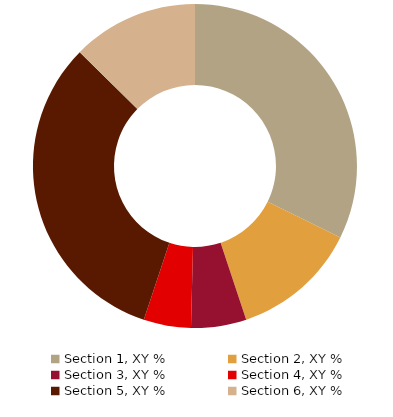
| Category | Turnover |
|---|---|
| Section 1, XY % | 8.2 |
| Section 2, XY % | 3.2 |
| Section 3, XY % | 1.4 |
| Section 4, XY % | 1.2 |
| Section 5, XY % | 8.2 |
| Section 6, XY % | 3.2 |